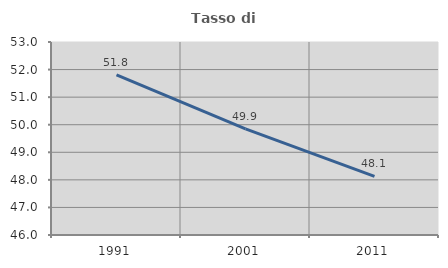
| Category | Tasso di occupazione   |
|---|---|
| 1991.0 | 51.807 |
| 2001.0 | 49.85 |
| 2011.0 | 48.128 |